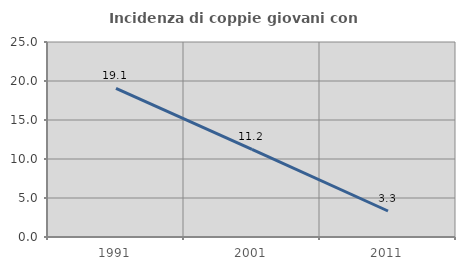
| Category | Incidenza di coppie giovani con figli |
|---|---|
| 1991.0 | 19.061 |
| 2001.0 | 11.222 |
| 2011.0 | 3.333 |